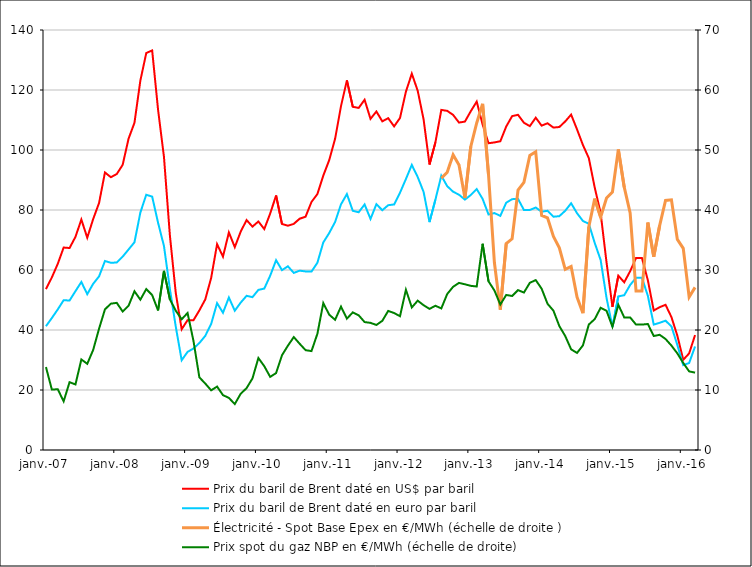
| Category | Prix du baril de Brent daté en US$ par baril | Prix du baril de Brent daté en euro par baril |
|---|---|---|
| 2007-01-01 | 53.63 | 41.258 |
| 2007-02-01 | 57.52 | 43.995 |
| 2007-03-01 | 62.05 | 46.859 |
| 2007-04-01 | 67.49 | 49.936 |
| 2007-05-01 | 67.32 | 49.824 |
| 2007-06-01 | 71.05 | 52.946 |
| 2007-07-01 | 76.82 | 56.009 |
| 2007-08-01 | 70.76 | 51.945 |
| 2007-09-01 | 76.97 | 55.388 |
| 2007-10-01 | 82.34 | 57.874 |
| 2007-11-01 | 92.51 | 62.999 |
| 2007-12-01 | 90.93 | 62.407 |
| 2008-01-01 | 91.99 | 62.498 |
| 2008-02-01 | 95.05 | 64.453 |
| 2008-03-01 | 103.78 | 66.841 |
| 2008-04-01 | 109.07 | 69.249 |
| 2008-05-01 | 123.15 | 79.161 |
| 2008-06-01 | 132.32 | 85.082 |
| 2008-07-01 | 133.19 | 84.456 |
| 2008-08-01 | 113.42 | 75.742 |
| 2008-09-01 | 97.7 | 67.989 |
| 2008-10-01 | 71.59 | 53.735 |
| 2008-11-01 | 52.34 | 41.108 |
| 2008-12-01 | 40.25 | 29.927 |
| 2009-01-01 | 43.29 | 32.7 |
| 2009-02-01 | 43.26 | 33.837 |
| 2009-03-01 | 46.54 | 35.664 |
| 2009-04-01 | 50.19 | 38.049 |
| 2009-05-01 | 57.38 | 42.037 |
| 2009-06-01 | 68.61 | 48.953 |
| 2009-07-01 | 64.46 | 45.754 |
| 2009-08-01 | 72.52 | 50.829 |
| 2009-09-01 | 67.61 | 46.428 |
| 2009-10-01 | 72.77 | 49.127 |
| 2009-11-01 | 76.65 | 51.394 |
| 2009-12-01 | 74.46 | 50.953 |
| 2010-01-01 | 76.17 | 53.372 |
| 2010-02-01 | 73.64 | 53.809 |
| 2010-03-01 | 78.83 | 58.098 |
| 2010-04-01 | 84.84 | 63.274 |
| 2010-05-01 | 75.31 | 59.947 |
| 2010-06-01 | 74.76 | 61.236 |
| 2010-07-01 | 75.39 | 59.038 |
| 2010-08-01 | 77.09 | 59.783 |
| 2010-09-01 | 77.77 | 59.517 |
| 2010-10-01 | 82.67 | 59.481 |
| 2010-11-01 | 85.29 | 62.432 |
| 2010-12-01 | 91.47 | 69.188 |
| 2011-01-01 | 96.61 | 72.313 |
| 2011-02-01 | 103.73 | 76.003 |
| 2011-03-01 | 114.64 | 81.887 |
| 2011-04-01 | 123.21 | 85.311 |
| 2011-05-01 | 114.4 | 79.725 |
| 2011-06-01 | 114.03 | 79.251 |
| 2011-07-01 | 116.75 | 81.853 |
| 2011-08-01 | 110.38 | 77.034 |
| 2011-09-01 | 112.84 | 81.944 |
| 2011-10-01 | 109.55 | 79.928 |
| 2011-11-01 | 110.61 | 81.597 |
| 2011-12-01 | 107.87 | 81.852 |
| 2012-01-01 | 110.68 | 85.766 |
| 2012-02-01 | 119.44 | 90.321 |
| 2012-03-01 | 125.45 | 95.028 |
| 2012-04-01 | 119.75 | 90.986 |
| 2012-05-01 | 110.17 | 86.021 |
| 2012-06-01 | 95.16 | 75.966 |
| 2012-07-01 | 102.54 | 83.447 |
| 2012-08-01 | 113.364 | 91.428 |
| 2012-09-01 | 113.046 | 87.939 |
| 2012-10-01 | 111.7 | 86.098 |
| 2012-11-01 | 109.144 | 85.088 |
| 2012-12-01 | 109.464 | 83.466 |
| 2013-01-01 | 112.946 | 85.003 |
| 2013-02-01 | 116.129 | 86.981 |
| 2013-03-01 | 108.498 | 83.695 |
| 2013-04-01 | 102.256 | 78.502 |
| 2013-05-01 | 102.529 | 78.978 |
| 2013-06-01 | 102.92 | 78.034 |
| 2013-07-01 | 107.83 | 82.436 |
| 2013-08-01 | 111.29 | 83.612 |
| 2013-09-01 | 111.73 | 83.708 |
| 2013-10-01 | 109.08 | 79.999 |
| 2013-11-01 | 107.96 | 80.009 |
| 2013-12-01 | 110.76 | 80.822 |
| 2014-01-01 | 108.12 | 79.436 |
| 2014-02-01 | 108.91 | 79.733 |
| 2014-03-01 | 107.48 | 77.762 |
| 2014-04-01 | 107.66 | 77.946 |
| 2014-05-01 | 109.52 | 79.752 |
| 2014-06-01 | 111.8 | 82.251 |
| 2014-07-01 | 106.861 | 78.928 |
| 2014-08-01 | 101.664 | 76.35 |
| 2014-09-01 | 97.287 | 75.397 |
| 2014-10-01 | 87.463 | 69.017 |
| 2014-11-01 | 79.002 | 63.343 |
| 2014-12-01 | 62.51 | 50.689 |
| 2015-01-01 | 47.708 | 41.053 |
| 2015-02-01 | 58.1 | 51.2 |
| 2015-03-01 | 55.9 | 51.6 |
| 2015-04-01 | 59.6 | 55 |
| 2015-05-01 | 64 | 57.4 |
| 2015-06-01 | 64 | 57.4 |
| 2015-07-01 | 56.6 | 51.4 |
| 2015-08-01 | 46.5 | 41.8 |
| 2015-09-01 | 47.6 | 42.4 |
| 2015-10-01 | 48.4 | 43.1 |
| 2015-11-01 | 44.3 | 41.2 |
| 2015-12-01 | 38.1 | 35 |
| 2016-01-01 | 30.07 | 28.3 |
| 2016-02-01 | 32.2 | 29 |
| 2016-03-01 | 38.3 | 34.5 |